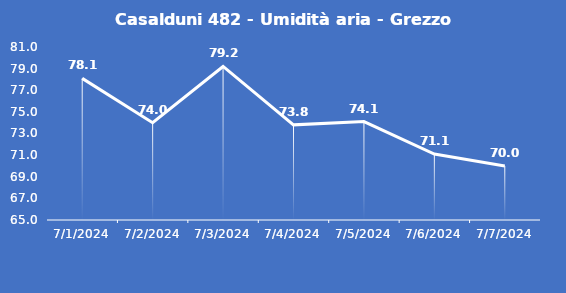
| Category | Casalduni 482 - Umidità aria - Grezzo (%) |
|---|---|
| 7/1/24 | 78.1 |
| 7/2/24 | 74 |
| 7/3/24 | 79.2 |
| 7/4/24 | 73.8 |
| 7/5/24 | 74.1 |
| 7/6/24 | 71.1 |
| 7/7/24 | 70 |